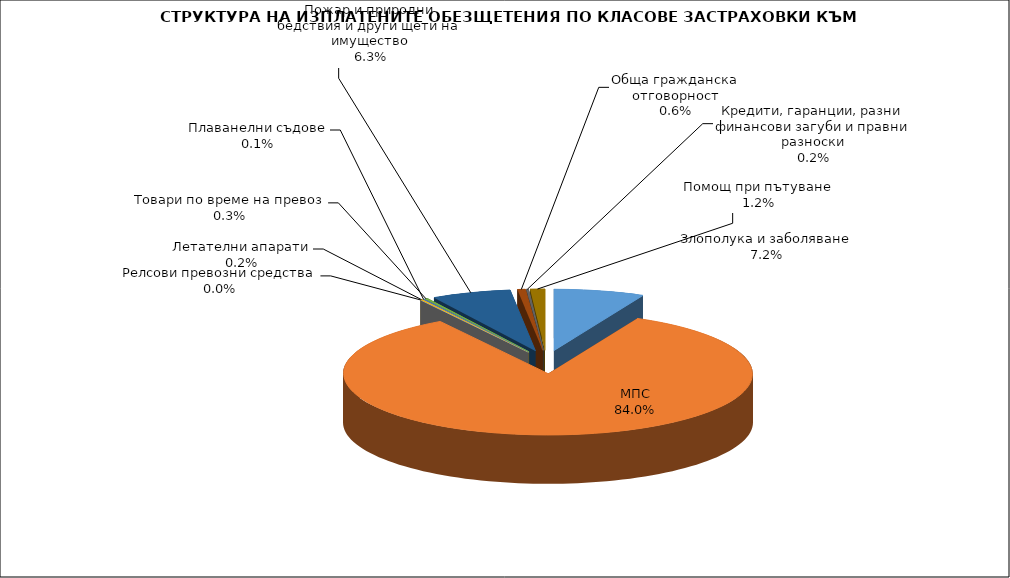
| Category | Злополука и заболяване |
|---|---|
| Злополука и заболяване | 0.072 |
| МПС | 0.84 |
| Релсови превозни средства | 0 |
| Летателни апарати | 0.002 |
| Плаванелни съдове | 0.001 |
| Товари по време на превоз | 0.003 |
| Пожар и природни бедствия и други щети на имущество | 0.063 |
| Обща гражданска отговорност | 0.006 |
| Кредити, гаранции, разни финансови загуби и правни разноски | 0.002 |
| Помощ при пътуване | 0.012 |